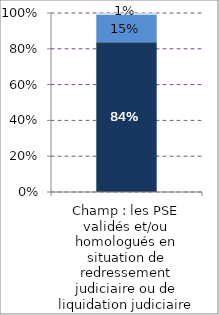
| Category | Homologation | Validation | Accord mixte (validation-homologation) |
|---|---|---|---|
| Champ : les PSE validés et/ou homologués en situation de redressement judiciaire ou de liquidation judiciaire | 0.837 | 0.153 | 0.01 |